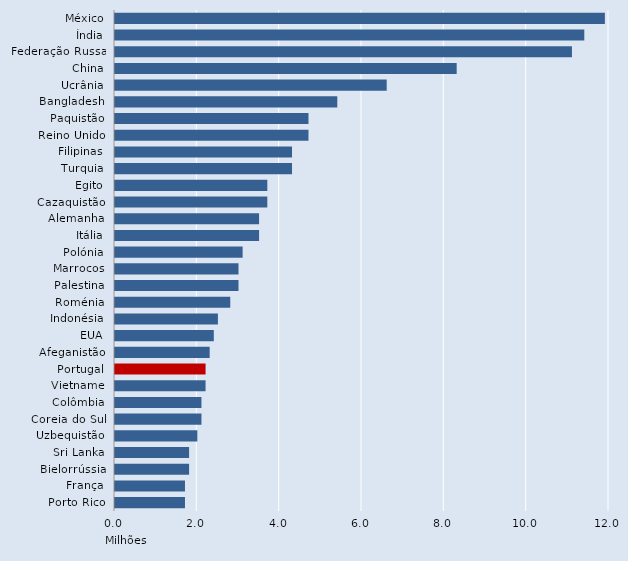
| Category | Series 0 |
|---|---|
| México | 11.9 |
| Índia | 11.4 |
| Federação Russa | 11.1 |
| China | 8.3 |
| Ucrânia | 6.6 |
| Bangladesh | 5.4 |
| Paquistão | 4.7 |
| Reino Unido | 4.7 |
| Filipinas | 4.3 |
| Turquia | 4.3 |
| Egito | 3.7 |
| Cazaquistão | 3.7 |
| Alemanha | 3.5 |
| Itália | 3.5 |
| Polónia | 3.1 |
| Marrocos | 3 |
| Palestina | 3 |
| Roménia | 2.8 |
| Indonésia | 2.5 |
| EUA | 2.4 |
| Afeganistão | 2.3 |
| Portugal | 2.2 |
| Vietname | 2.2 |
| Colômbia | 2.1 |
| Coreia do Sul | 2.1 |
| Uzbequistão | 2 |
| Sri Lanka | 1.8 |
| Bielorrússia | 1.8 |
| França | 1.7 |
| Porto Rico | 1.7 |